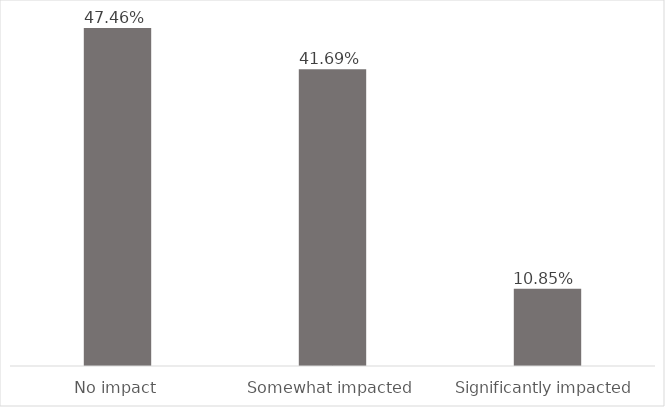
| Category | Series 0 |
|---|---|
| No impact | 0.475 |
| Somewhat impacted | 0.417 |
| Significantly impacted | 0.108 |